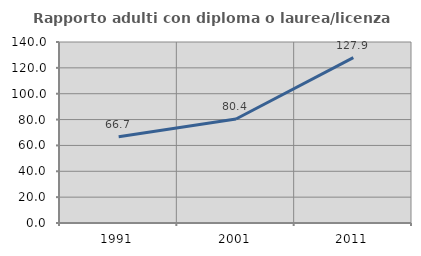
| Category | Rapporto adulti con diploma o laurea/licenza media  |
|---|---|
| 1991.0 | 66.667 |
| 2001.0 | 80.432 |
| 2011.0 | 127.902 |